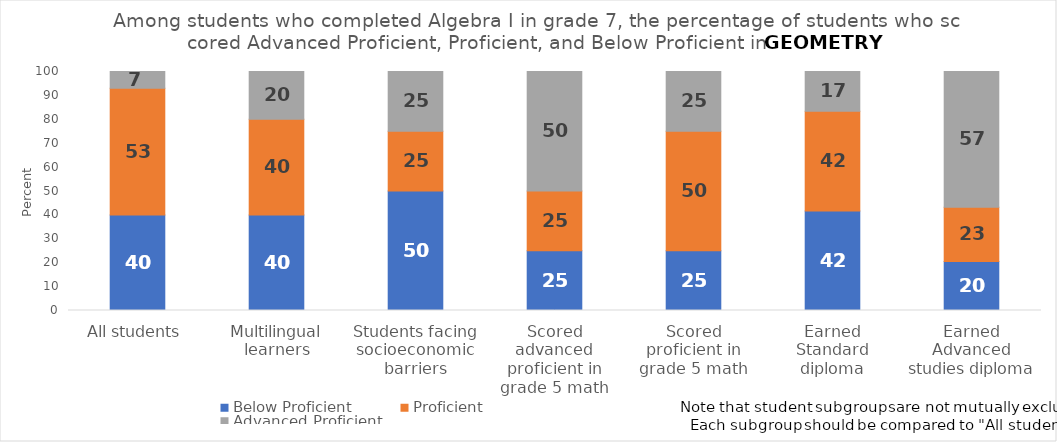
| Category | Below Proficient | Proficient | Advanced Proficient |
|---|---|---|---|
| All students | 40 | 53 | 7 |
| Multilingual learners | 40 | 40 | 20 |
| Students facing socioeconomic barriers | 50 | 25 | 25 |
| Scored advanced proficient in grade 5 math | 25 | 25 | 50 |
| Scored proficient in grade 5 math | 25 | 50 | 25 |
| Earned Standard diploma | 41.667 | 41.667 | 16.667 |
| Earned Advanced studies diploma | 20.455 | 22.727 | 56.818 |